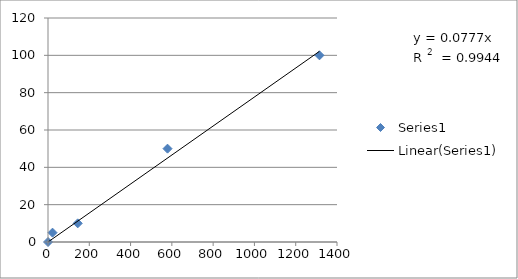
| Category | Series 0 |
|---|---|
| 0.0 | 0 |
| 22.0 | 5 |
| 144.0 | 10 |
| 579.0 | 50 |
| 1315.0 | 100 |